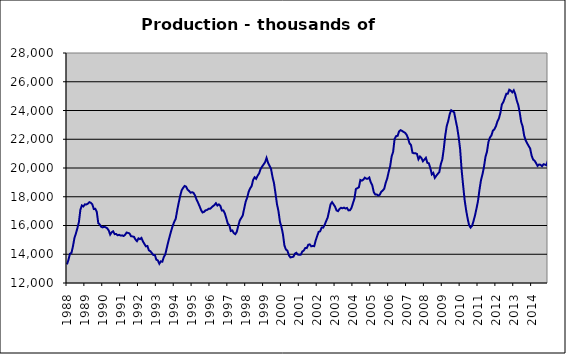
| Category | Series 0 |
|---|---|
| 1988.0 | 13298 |
| nan | 13613 |
| nan | 14036 |
| nan | 14095 |
| nan | 14552 |
| nan | 15129 |
| nan | 15453 |
| nan | 15821 |
| nan | 16239 |
| nan | 17103 |
| nan | 17396 |
| nan | 17325 |
| 1989.0 | 17470 |
| nan | 17468 |
| nan | 17520 |
| nan | 17623 |
| nan | 17580 |
| nan | 17470 |
| nan | 17146 |
| nan | 17161 |
| nan | 16951 |
| nan | 16166 |
| nan | 16071 |
| nan | 15906 |
| 1990.0 | 15869 |
| nan | 15914 |
| nan | 15868 |
| nan | 15812 |
| nan | 15656 |
| nan | 15368 |
| nan | 15531 |
| nan | 15596 |
| nan | 15400 |
| nan | 15410 |
| nan | 15322 |
| nan | 15353 |
| 1991.0 | 15299 |
| nan | 15313 |
| nan | 15269 |
| nan | 15352 |
| nan | 15508 |
| nan | 15484 |
| nan | 15445 |
| nan | 15255 |
| nan | 15241 |
| nan | 15209 |
| nan | 15023 |
| nan | 14910 |
| 1992.0 | 15103 |
| nan | 15050 |
| nan | 15135 |
| nan | 14888 |
| nan | 14713 |
| nan | 14549 |
| nan | 14574 |
| nan | 14269 |
| nan | 14214 |
| nan | 14079 |
| nan | 13946 |
| nan | 13943 |
| 1993.0 | 13620 |
| nan | 13569 |
| nan | 13340 |
| nan | 13504 |
| nan | 13481 |
| nan | 13797 |
| nan | 13989 |
| nan | 14432 |
| nan | 14873 |
| nan | 15260 |
| nan | 15641 |
| nan | 15980 |
| 1994.0 | 16256 |
| nan | 16466 |
| nan | 17054 |
| nan | 17574 |
| nan | 18062 |
| nan | 18451 |
| nan | 18618 |
| nan | 18754 |
| nan | 18702 |
| nan | 18488 |
| nan | 18404 |
| nan | 18280 |
| 1995.0 | 18315 |
| nan | 18263 |
| nan | 18087 |
| nan | 17804 |
| nan | 17586 |
| nan | 17349 |
| nan | 17082 |
| nan | 16908 |
| nan | 16945 |
| nan | 17055 |
| nan | 17076 |
| nan | 17157 |
| 1996.0 | 17157 |
| nan | 17246 |
| nan | 17345 |
| nan | 17421 |
| nan | 17552 |
| nan | 17389 |
| nan | 17467 |
| nan | 17359 |
| nan | 17039 |
| nan | 17049 |
| nan | 16842 |
| nan | 16490 |
| 1997.0 | 16125 |
| nan | 16022 |
| nan | 15618 |
| nan | 15657 |
| nan | 15473 |
| nan | 15399 |
| nan | 15558 |
| nan | 15966 |
| nan | 16344 |
| nan | 16521 |
| nan | 16693 |
| nan | 17188 |
| 1998.0 | 17666 |
| nan | 17940 |
| nan | 18356 |
| nan | 18585 |
| nan | 18742 |
| nan | 19179 |
| nan | 19354 |
| nan | 19252 |
| nan | 19468 |
| nan | 19619 |
| nan | 19925 |
| nan | 20099 |
| 1999.0 | 20243 |
| nan | 20402 |
| nan | 20700 |
| nan | 20367 |
| nan | 20147 |
| nan | 19940 |
| nan | 19377 |
| nan | 18941 |
| nan | 18238 |
| nan | 17487 |
| nan | 16998 |
| nan | 16256 |
| 2000.0 | 15900 |
| nan | 15406 |
| nan | 14611 |
| nan | 14329 |
| nan | 14253 |
| nan | 13932 |
| nan | 13779 |
| nan | 13801.4 |
| nan | 13830.4 |
| nan | 14037.4 |
| nan | 14101.4 |
| nan | 13983.1 |
| 2001.0 | 13960.1 |
| nan | 13974.1 |
| nan | 14189.1 |
| nan | 14260.1 |
| nan | 14432.1 |
| nan | 14427.1 |
| nan | 14658.1 |
| nan | 14686.7 |
| nan | 14553.7 |
| nan | 14574.7 |
| nan | 14561.7 |
| nan | 14957 |
| 2002.0 | 15275 |
| nan | 15557 |
| nan | 15595 |
| nan | 15856 |
| nan | 15851.599 |
| nan | 16039.659 |
| nan | 16305.273 |
| nan | 16538.099 |
| nan | 17002.492 |
| nan | 17480.564 |
| nan | 17624.181 |
| nan | 17467.591 |
| 2003.0 | 17309.332 |
| nan | 17053.665 |
| nan | 16997.03 |
| nan | 17151.655 |
| nan | 17232.406 |
| nan | 17196.823 |
| nan | 17241.683 |
| nan | 17181.379 |
| nan | 17220.897 |
| nan | 17052.724 |
| nan | 17061.407 |
| nan | 17213.928 |
| 2004.0 | 17541.226 |
| nan | 17867.995 |
| nan | 18539.895 |
| nan | 18598.329 |
| nan | 18656.076 |
| nan | 19166.251 |
| nan | 19120.661 |
| nan | 19189.733 |
| nan | 19328.127 |
| nan | 19258.289 |
| nan | 19252.511 |
| nan | 19338.37 |
| 2005.0 | 18996.26 |
| nan | 18796.585 |
| nan | 18320.167 |
| nan | 18157.703 |
| nan | 18162.296 |
| nan | 18079.378 |
| nan | 18137.193 |
| nan | 18341.12 |
| nan | 18433.673 |
| nan | 18552.613 |
| nan | 18965.757 |
| nan | 19260.619 |
| 2006.0 | 19721.48 |
| nan | 20125.464 |
| nan | 20802.737 |
| nan | 21126.107 |
| nan | 22029.619 |
| nan | 22217.811 |
| nan | 22237.362 |
| nan | 22547.07 |
| nan | 22632.333 |
| nan | 22582.778 |
| nan | 22510.289 |
| nan | 22448.548 |
| 2007.0 | 22323.973 |
| nan | 22075.929 |
| nan | 21715.697 |
| nan | 21604.441 |
| nan | 21062.597 |
| nan | 21023.355 |
| nan | 21024.846 |
| nan | 20981.485 |
| nan | 20607.715 |
| nan | 20797.229 |
| nan | 20694.61 |
| nan | 20471.092 |
| 2008.0 | 20585.2 |
| nan | 20710.561 |
| nan | 20358.458 |
| nan | 20325.647 |
| nan | 19979.543 |
| nan | 19554.517 |
| nan | 19651.268 |
| nan | 19311.858 |
| nan | 19461.289 |
| nan | 19595.012 |
| nan | 19713.509 |
| nan | 20258.46 |
| 2009.0 | 20578.483 |
| nan | 21319.355 |
| nan | 22259.016 |
| nan | 22920.613 |
| nan | 23274.392 |
| nan | 23748.382 |
| nan | 24015.968 |
| nan | 23949.497 |
| nan | 23863.422 |
| nan | 23322.324 |
| nan | 22828.491 |
| nan | 22156.289 |
| 2010.0 | 21300.696 |
| nan | 19860.435 |
| nan | 18798.577 |
| nan | 17788.895 |
| nan | 17077.542 |
| nan | 16503.382 |
| nan | 16020.404 |
| nan | 15856.582 |
| nan | 15970.325 |
| nan | 16313.459 |
| nan | 16710.849 |
| nan | 17190.1 |
| 2011.0 | 17714.519 |
| nan | 18495.045 |
| nan | 19156.284 |
| nan | 19557.491 |
| nan | 20077.898 |
| nan | 20765.665 |
| nan | 21128.425 |
| nan | 21807.194 |
| nan | 22118.818 |
| nan | 22265.055 |
| nan | 22598.415 |
| nan | 22689.418 |
| 2012.0 | 22897.671 |
| nan | 23231.411 |
| nan | 23440.859 |
| nan | 23818.515 |
| nan | 24413.871 |
| nan | 24588.394 |
| nan | 24861.032 |
| nan | 25161.729 |
| nan | 25167.17 |
| nan | 25447.846 |
| nan | 25381.393 |
| nan | 25264.451 |
| 2013.0 | 25405.25 |
| nan | 25140.11 |
| nan | 24700.704 |
| nan | 24392.196 |
| nan | 23867.507 |
| nan | 23197.845 |
| nan | 22875.331 |
| nan | 22255.465 |
| nan | 21921.342 |
| nan | 21717.58 |
| nan | 21535.364 |
| nan | 21359.765 |
| 2014.0 | 20861.327 |
| nan | 20587.907 |
| nan | 20504.788 |
| nan | 20340.152 |
| nan | 20140.75 |
| nan | 20242.709 |
| nan | 20223.714 |
| nan | 20123.464 |
| nan | 20262.206 |
| nan | 20237.921 |
| nan | 20191.941 |
| nan | 20549.894 |